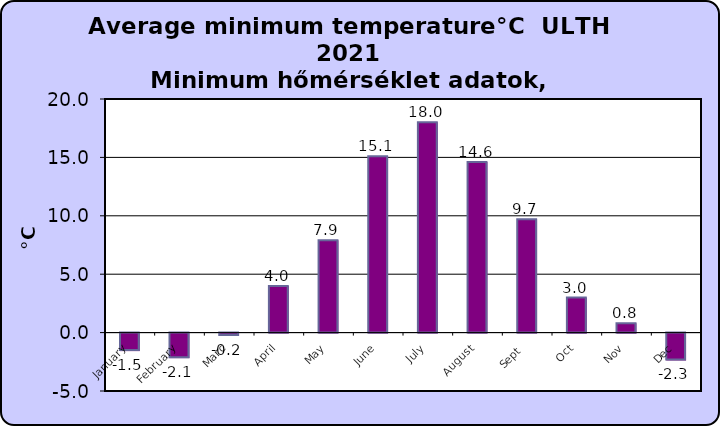
| Category | Series 0 |
|---|---|
| January | -1.5 |
| February | -2.1 |
| Marc | -0.2 |
| April | 4 |
| May | 7.9 |
| June | 15.1 |
| July | 18 |
| August | 14.6 |
| Sept  | 9.7 |
| Oct | 3 |
| Nov | 0.8 |
| Dec | -2.3 |